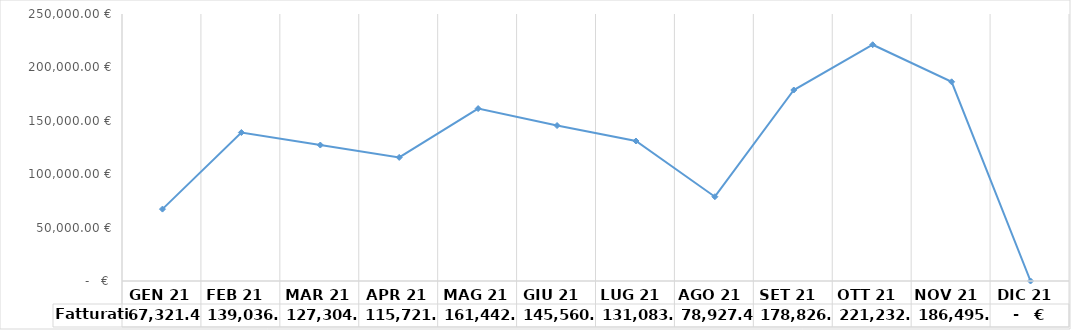
| Category | Fatturati |
|---|---|
|  GEN 21   | 67321.45 |
|  FEB 21   | 139036.976 |
|  MAR 21   | 127304.934 |
|  APR 21   | 115721.296 |
|  MAG 21   | 161442.35 |
| GIU 21  | 145560.03 |
| LUG 21  | 131083.094 |
| AGO 21  | 78927.42 |
| SET 21  | 178826.417 |
| OTT 21  | 221232.367 |
| NOV 21  | 186495.991 |
| DIC 21  | 0 |